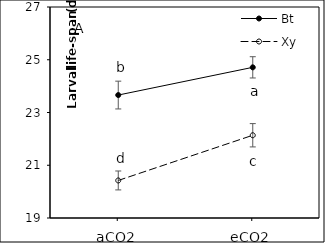
| Category | Bt | Xy |
|---|---|---|
| aCO2 | 23.661 | 20.423 |
| eCO2 | 24.712 | 22.137 |